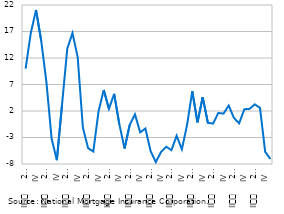
| Category | Period | Annual growth of real estate prices (%) |
|---|---|---|
| II
     2008 |  | 10.003 |
| III |  | 16.731 |
| IV |  | 21.051 |
| I
2009 |  | 15.225 |
| II
     2009 |  | 7.382 |
| III |  | -3.239 |
| IV
 |  | -7.272 |
| I
2010 |  | 3.265 |
| II
     2010 |  | 13.741 |
| III |  | 16.702 |
| IV |  | 12.159 |
| I
2011 |  | -1.151 |
| II
     2011 |  | -5.01 |
| III |  | -5.661 |
| IV |  | 1.922 |
| I
2012 |  | 5.976 |
| II
     2012 |  | 2.405 |
| III |  | 5.231 |
| IV |  | -0.519 |
| I
2013 |  | -5.083 |
| II
     2013 |  | -0.581 |
| III |  | 1.362 |
| IV |  | -2.027 |
| I
2014 |  | -1.304 |
| II
     2014 |  | -5.572 |
| III |  | -7.641 |
| IV |  | -5.739 |
| I
2015 |  | -4.743 |
| II
     2015 |  | -5.396 |
| III |  | -2.67 |
| IV |  | -5.226 |
| I
2016 |  | -0.657 |
| II
     2016 |  | 5.734 |
| III |  | -0.155 |
| IV |  | 4.606 |
| I
2017 |  | -0.243 |
| II
     2017 |  | -0.373 |
| III |  | 1.631 |
| IV |  | 1.513 |
| I
2018 |  | 3.024 |
| II
     2018 |  | 0.684 |
| III |  | -0.325 |
| IV |  | 2.337 |
| I
2019 |  | 2.405 |
| II
     2019 |  | 3.257 |
| III |  | 2.597 |
| IV |  | -5.704 |